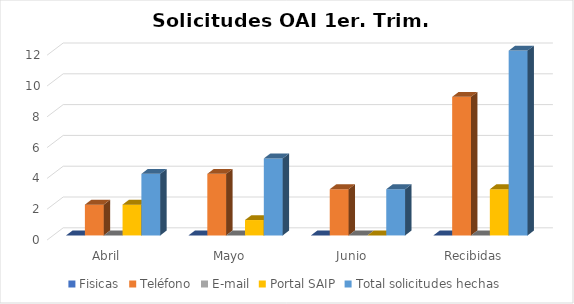
| Category | Fisicas | Teléfono | E-mail | Portal SAIP | Total solicitudes hechas |
|---|---|---|---|---|---|
| Abril | 0 | 2 | 0 | 2 | 4 |
| Mayo | 0 | 4 | 0 | 1 | 5 |
| Junio | 0 | 3 | 0 | 0 | 3 |
| Recibidas | 0 | 9 | 0 | 3 | 12 |